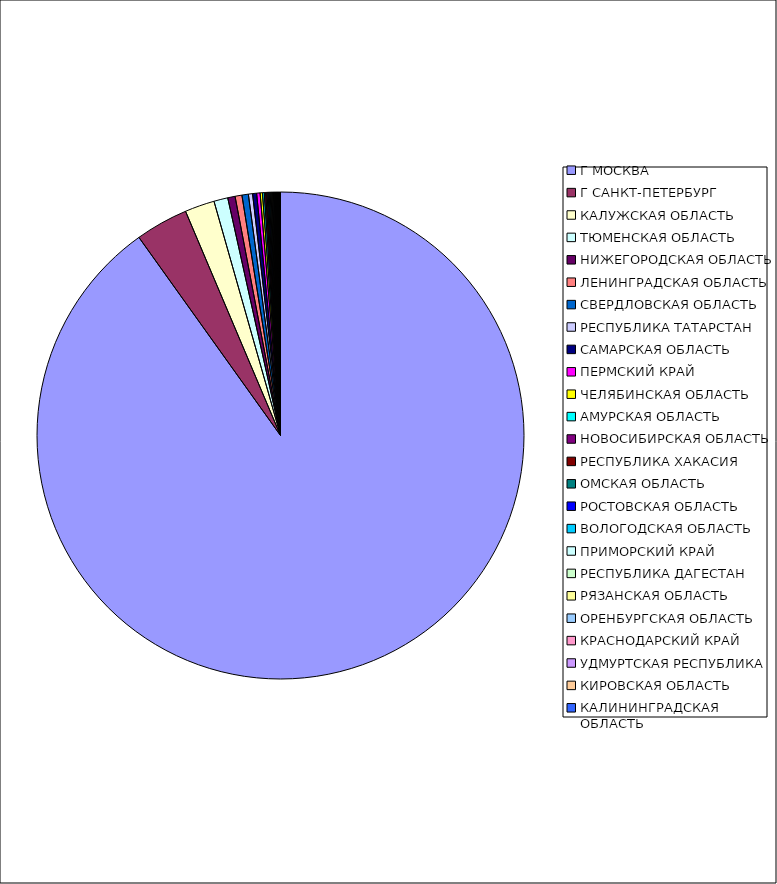
| Category | Оборот |
|---|---|
| Г МОСКВА | 0.901 |
| Г САНКТ-ПЕТЕРБУРГ | 0.035 |
| КАЛУЖСКАЯ ОБЛАСТЬ | 0.02 |
| ТЮМЕНСКАЯ ОБЛАСТЬ | 0.009 |
| НИЖЕГОРОДСКАЯ ОБЛАСТЬ | 0.005 |
| ЛЕНИНГРАДСКАЯ ОБЛАСТЬ | 0.005 |
| СВЕРДЛОВСКАЯ ОБЛАСТЬ | 0.004 |
| РЕСПУБЛИКА ТАТАРСТАН | 0.003 |
| САМАРСКАЯ ОБЛАСТЬ | 0.003 |
| ПЕРМСКИЙ КРАЙ | 0.002 |
| ЧЕЛЯБИНСКАЯ ОБЛАСТЬ | 0.002 |
| АМУРСКАЯ ОБЛАСТЬ | 0.001 |
| НОВОСИБИРСКАЯ ОБЛАСТЬ | 0.001 |
| РЕСПУБЛИКА ХАКАСИЯ | 0.001 |
| ОМСКАЯ ОБЛАСТЬ | 0.001 |
| РОСТОВСКАЯ ОБЛАСТЬ | 0.001 |
| ВОЛОГОДСКАЯ ОБЛАСТЬ | 0.001 |
| ПРИМОРСКИЙ КРАЙ | 0.001 |
| РЕСПУБЛИКА ДАГЕСТАН | 0.001 |
| РЯЗАНСКАЯ ОБЛАСТЬ | 0.001 |
| ОРЕНБУРГСКАЯ ОБЛАСТЬ | 0.001 |
| КРАСНОДАРСКИЙ КРАЙ | 0 |
| УДМУРТСКАЯ РЕСПУБЛИКА | 0 |
| КИРОВСКАЯ ОБЛАСТЬ | 0 |
| КАЛИНИНГРАДСКАЯ ОБЛАСТЬ | 0 |
| РЕСПУБЛИКА БАШКОРТОСТАН | 0 |
| ЛИПЕЦКАЯ ОБЛАСТЬ | 0 |
| СТАВРОПОЛЬСКИЙ КРАЙ | 0 |
| САРАТОВСКАЯ ОБЛАСТЬ | 0 |
| ИВАНОВСКАЯ ОБЛАСТЬ | 0 |
| БЕЛГОРОДСКАЯ ОБЛАСТЬ | 0 |
| РЕСПУБЛИКА КОМИ | 0 |
| СМОЛЕНСКАЯ ОБЛАСТЬ | 0 |
| ПСКОВСКАЯ ОБЛАСТЬ | 0 |
| АЛТАЙСКИЙ КРАЙ | 0 |
| ИРКУТСКАЯ ОБЛАСТЬ | 0 |
| РЕСПУБЛИКА МОРДОВИЯ | 0 |
| РЕСПУБЛИКА СЕВЕРНАЯ ОСЕТИЯ-АЛАНИЯ | 0 |
| ТУЛЬСКАЯ ОБЛАСТЬ | 0 |
| КАБАРДИНО-БАЛКАРСКАЯ РЕСПУБЛИКА | 0 |
| УЛЬЯНОВСКАЯ ОБЛАСТЬ | 0 |
| КЕМЕРОВСКАЯ ОБЛАСТЬ | 0 |
| КРАСНОЯРСКИЙ КРАЙ | 0 |